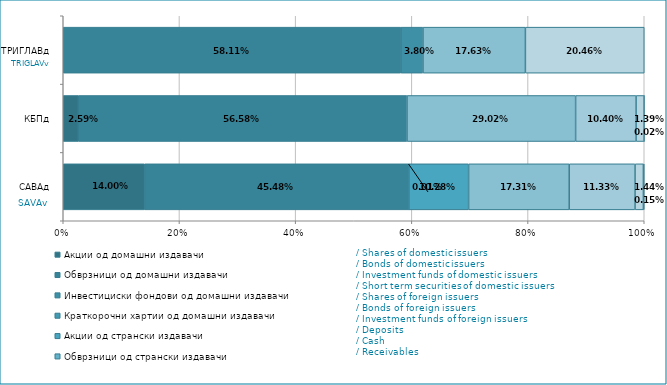
| Category | Акции од домашни издавачи  | Обврзници од домашни издавачи  | Инвестициски фондови од домашни издавачи   | Краткорочни хартии од домашни издавачи   | Акции од странски издавачи   | Обврзници од странски издавачи  | Инвестициски фондови од странски издавчи  | Депозити | Парични средства | Побарувања |
|---|---|---|---|---|---|---|---|---|---|---|
| САВАд | 0.14 | 0.455 | 0 | 0 | 0.103 | 0 | 0.173 | 0.113 | 0.014 | 0.001 |
| КБПд | 0.026 | 0.566 | 0 | 0 | 0 | 0 | 0.29 | 0.104 | 0.014 | 0 |
| ТРИГЛАВд | 0 | 0.581 | 0.038 | 0 | 0 | 0 | 0.176 | 0 | 0.205 | 0 |